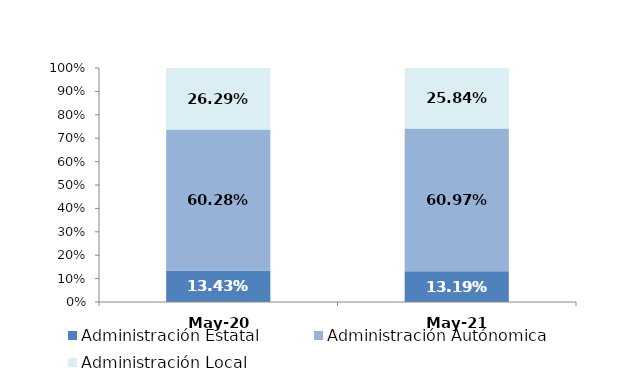
| Category | Administración Estatal | Administración Autónomica | Administración Local |
|---|---|---|---|
| 2020-05-01 | 0.134 | 0.603 | 0.263 |
| 2021-05-01 | 0.132 | 0.61 | 0.258 |